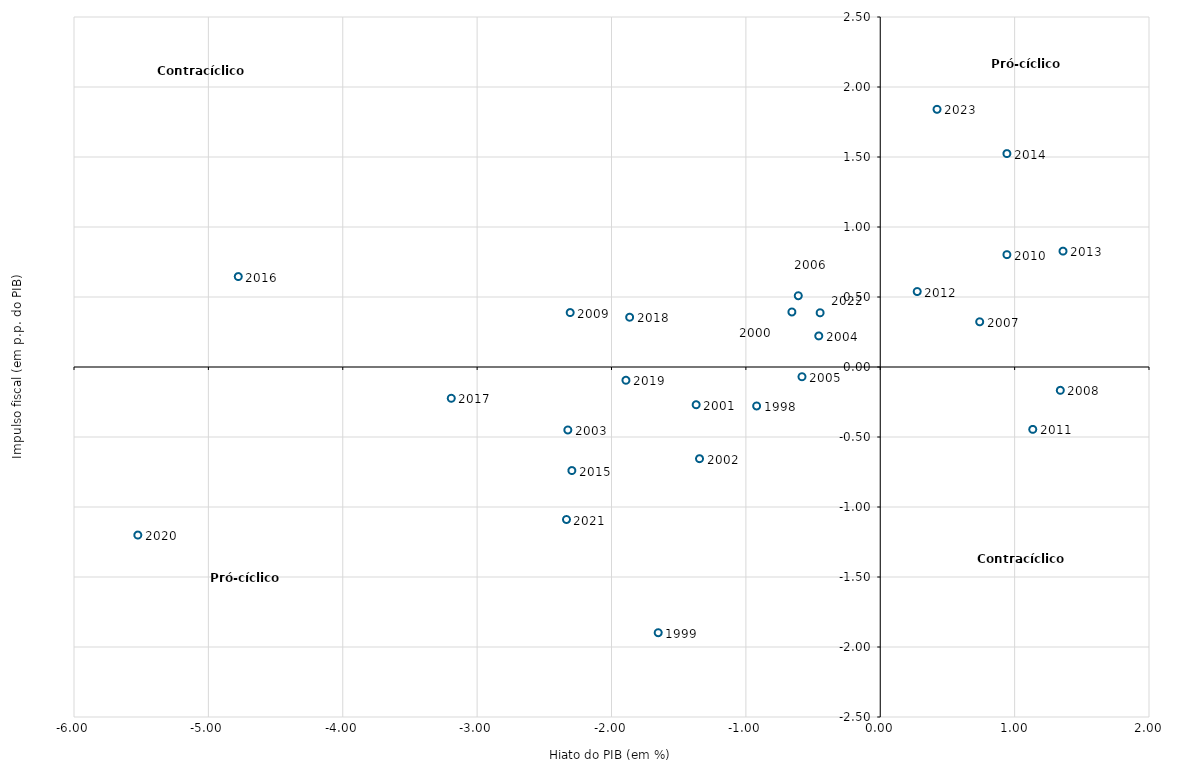
| Category | Series 1 |
|---|---|
| -0.9199999999999999 | -0.279 |
| -1.6525 | -1.898 |
| -0.6575000000000001 | 0.393 |
| -1.37 | -0.269 |
| -1.3449999999999998 | -0.655 |
| -2.3249999999999997 | -0.45 |
| -0.4575000000000001 | 0.222 |
| -0.5825 | -0.07 |
| -0.61 | 0.509 |
| 0.74 | 0.323 |
| 1.3399999999999999 | -0.167 |
| -2.3074999999999997 | 0.389 |
| 0.9425000000000001 | 0.803 |
| 1.135 | -0.445 |
| 0.275 | 0.539 |
| 1.36 | 0.828 |
| 0.9425 | 1.524 |
| -2.295 | -0.74 |
| -4.7775 | 0.646 |
| -3.1925 | -0.223 |
| -1.8649999999999998 | 0.356 |
| -1.8925 | -0.095 |
| -5.525 | -1.2 |
| -2.335 | -1.089 |
| -0.44749999999999995 | 0.387 |
| 0.4225 | 1.84 |